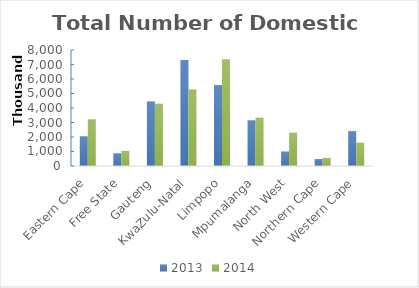
| Category | 2013 | 2014 |
|---|---|---|
| Eastern Cape | 2050000 | 3224000 |
| Free State | 878000 | 1043000 |
| Gauteng | 4456000 | 4293000 |
| KwaZulu-Natal | 7307000 | 5280000 |
| Limpopo | 5583000 | 7367000 |
| Mpumalanga | 3153000 | 3330000 |
| North West | 994000 | 2298000 |
| Northern Cape | 480000 | 557000 |
| Western Cape | 2406000 | 1606000 |